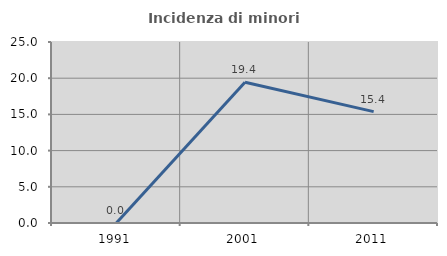
| Category | Incidenza di minori stranieri |
|---|---|
| 1991.0 | 0 |
| 2001.0 | 19.444 |
| 2011.0 | 15.385 |